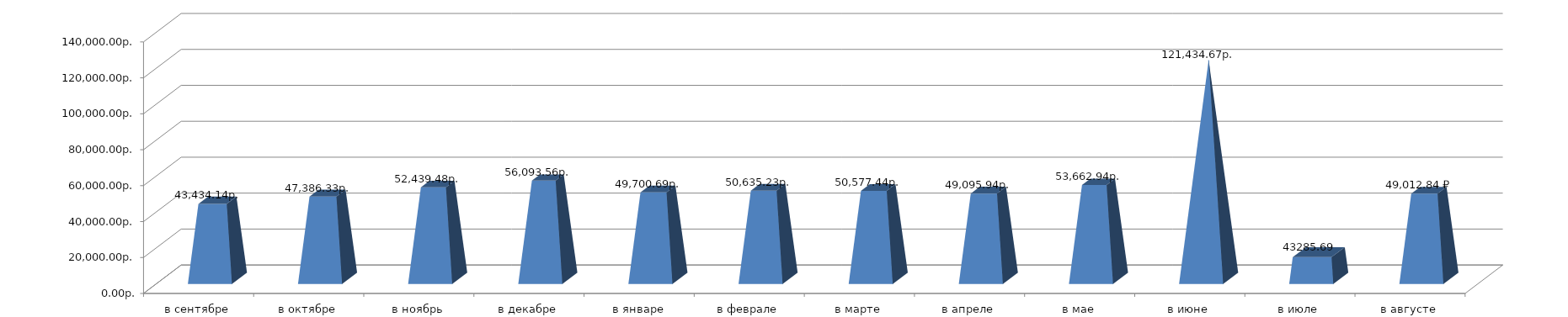
| Category | Series 0 |
|---|---|
| в сентябре | 43434.14 |
| в октябре | 47386.33 |
| в ноябрь | 52439.48 |
| в декабре | 56093.56 |
| в январе | 49700.69 |
| в феврале | 50635.23 |
| в марте | 50577.44 |
| в апреле | 49095.94 |
| в мае | 53662.94 |
| в июне | 121434.67 |
| в июле | 14563.68 |
| в августе | 49012.84 |